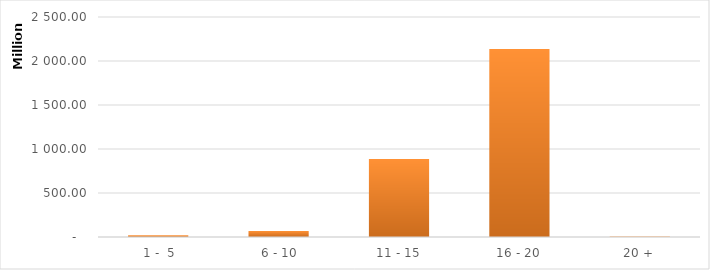
| Category | Series 0 |
|---|---|
|  1 -  5 | 19180946.455 |
|  6 - 10 | 68576527.391 |
| 11 - 15 | 885459375.052 |
| 16 - 20 | 2136166833.281 |
| 20 + | 6145410.991 |